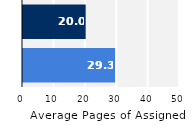
| Category | Series 0 |
|---|---|
| Upper Division | 29.329 |
| Lower Division | 19.962 |